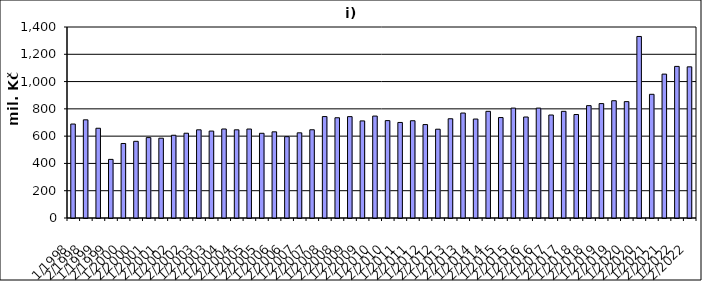
| Category | Series 0 |
|---|---|
| 1/1998 | 688760.017 |
| 2/1998 | 719496.928 |
| 1/1999 | 657840.827 |
| 2/1999 | 429661.173 |
| 1/2000 | 546087.943 |
| 2/2000 | 562028.057 |
| 1/2001 | 589251.452 |
| 2/2001 | 584991.289 |
| 1/2002 | 606497 |
| 2/2002 | 621398 |
| 1/2003 | 646316 |
| 2/2003 | 637148.132 |
| 1/2004 | 652400.03 |
| 2/2004 | 646292.268 |
| 1/2005 | 652030 |
| 2/2005 | 620936.919 |
| 1/2006 | 631555 |
| 2/2006 | 596217 |
| 1/2007 | 624186 |
| 2/2007 | 646645 |
| 1/2008 | 743418.13 |
| 2/2008 | 734809.87 |
| 1/2009 | 743053 |
| 2/2009 | 711641 |
| 1/2010 | 747131 |
| 2/2010 | 713784 |
| 1/2011 | 700318 |
| 2/2011 | 712877 |
| 1/2012 | 684822 |
| 2/2012 | 650844 |
| 1/2013 | 727398 |
| 2/2013 | 769389 |
| 1/2014 | 725395 |
| 2/2014 | 781835 |
| 1/2015 | 736272 |
| 2/2015 | 805599 |
| 1/2016 | 740296 |
| 2/2016 | 805540 |
| 1/2017 | 754869 |
| 2/2017 | 781815 |
| 1/2018 | 758456.263 |
| 2/2018 | 823516.788 |
| 1/2019 | 838667.32 |
| 2/2019 | 859575.559 |
| 1/2020 | 852916.87 |
| 2/2020 | 1330652.13 |
| 1/2021 | 906676.504 |
| 2/2021 | 1054667.429 |
| 1/2022 | 1111266.39 |
| 2/2022 | 1107928.406 |